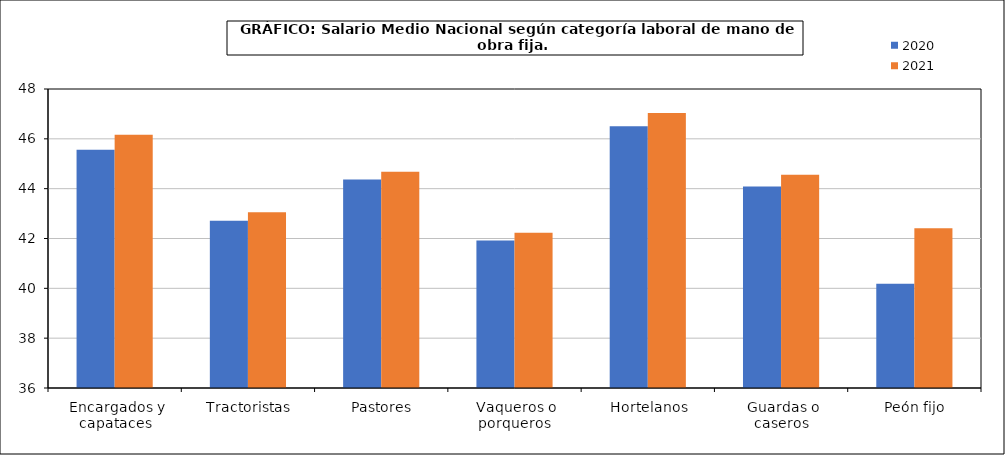
| Category | 2020 | 2021 |
|---|---|---|
|  Encargados y capataces | 45.56 | 46.16 |
|  Tractoristas | 42.71 | 43.05 |
|  Pastores | 44.37 | 44.68 |
|  Vaqueros o porqueros | 41.92 | 42.23 |
|  Hortelanos | 46.51 | 47.04 |
|  Guardas o caseros | 44.09 | 44.56 |
|  Peón fijo | 40.18 | 42.41 |